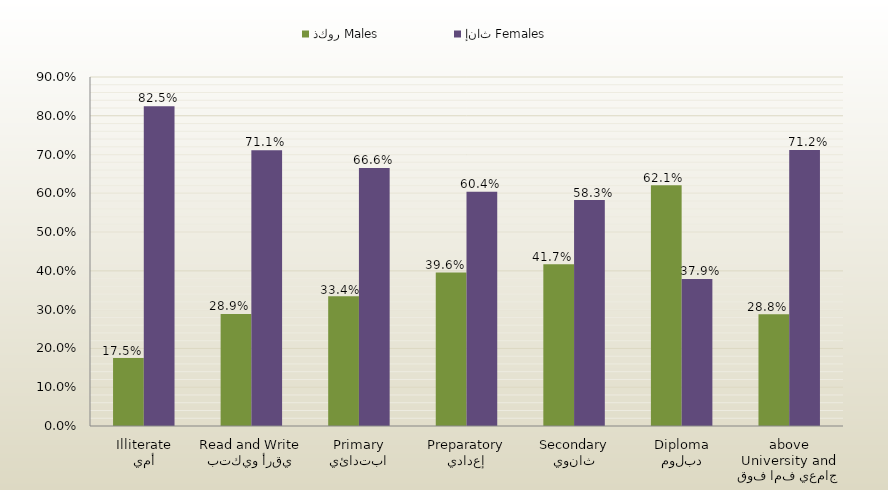
| Category | ذكور Males | إناث Females |
|---|---|---|
| أمي
Illiterate | 0.175 | 0.825 |
| يقرأ ويكتب
Read and Write | 0.289 | 0.711 |
| ابتدائي
Primary | 0.334 | 0.666 |
| إعدادي
Preparatory | 0.396 | 0.604 |
| ثانوي
Secondary | 0.417 | 0.583 |
| دبلوم
Diploma | 0.621 | 0.379 |
| جامعي فما فوق
University and above | 0.288 | 0.712 |